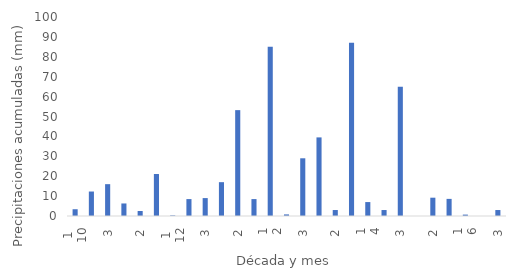
| Category | Suma PP |
|---|---|
| 0 | 3.4 |
| 1 | 12.3 |
| 2 | 16 |
| 3 | 6.3 |
| 4 | 2.5 |
| 5 | 21.1 |
| 6 | 0.3 |
| 7 | 8.5 |
| 8 | 9 |
| 9 | 17 |
| 10 | 53.2 |
| 11 | 8.5 |
| 12 | 85 |
| 13 | 0.8 |
| 14 | 29 |
| 15 | 39.5 |
| 16 | 3 |
| 17 | 87 |
| 18 | 7 |
| 19 | 3 |
| 20 | 65 |
| 21 | 0 |
| 22 | 9.2 |
| 23 | 8.6 |
| 24 | 0.7 |
| 25 | 0 |
| 26 | 3 |